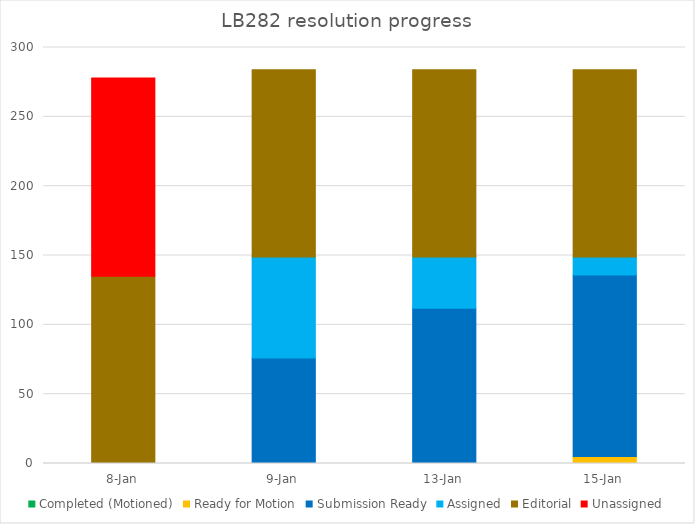
| Category | Completed (Motioned) | Ready for Motion | Submission Ready | Assigned | Editorial | Unassigned |
|---|---|---|---|---|---|---|
| 2024-01-08 | 0 | 0 | 0 | 0 | 135 | 143 |
| 2024-01-09 | 0 | 0 | 76 | 73 | 135 | 0 |
| 2024-01-13 | 0 | 0 | 112 | 37 | 135 | 0 |
| 2024-01-15 | 0 | 5 | 131 | 13 | 135 | 0 |